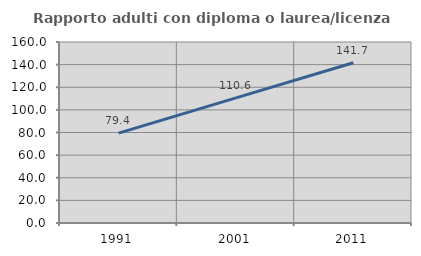
| Category | Rapporto adulti con diploma o laurea/licenza media  |
|---|---|
| 1991.0 | 79.416 |
| 2001.0 | 110.646 |
| 2011.0 | 141.668 |